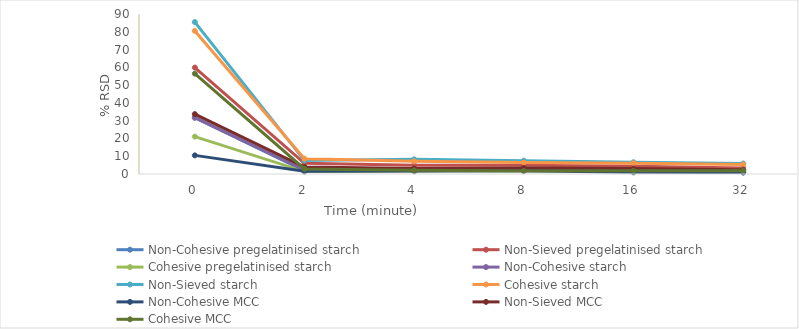
| Category | Non-Cohesive pregelatinised starch | Non-Sieved pregelatinised starch | Cohesive pregelatinised starch | Non-Cohesive starch | Non-Sieved starch | Cohesive starch | Non-Cohesive MCC | Non-Sieved MCC | Cohesive MCC |
|---|---|---|---|---|---|---|---|---|---|
| 0.0 | 31.68 | 59.884 | 21.023 | 31.68 | 85.465 | 80.492 | 10.47 | 33.688 | 56.439 |
| 2.0 | 1.878 | 6.01 | 1.348 | 2.301 | 7.561 | 8.586 | 1.494 | 3.909 | 2.874 |
| 4.0 | 1.95 | 4.922 | 1.659 | 2.221 | 8.25 | 7.117 | 1.676 | 3.084 | 2.045 |
| 8.0 | 2.182 | 4.956 | 1.919 | 2.358 | 7.502 | 6.412 | 1.866 | 3.413 | 1.679 |
| 16.0 | 1.622 | 4.41 | 2.445 | 1.758 | 6.584 | 6.083 | 0.948 | 3.047 | 1.836 |
| 32.0 | 1.249 | 3.334 | 2.436 | 1.38 | 5.882 | 5.37 | 0.794 | 2.398 | 1.884 |